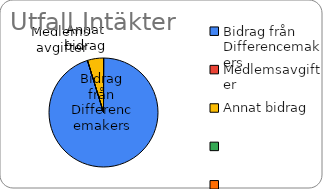
| Category | Utfall |
|---|---|
| Bidrag från Differencemakers | 1000 |
| Medlemsavgifter | 0 |
| Annat bidrag | 50 |